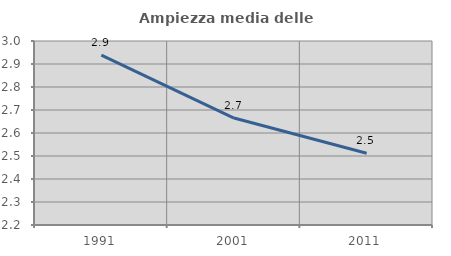
| Category | Ampiezza media delle famiglie |
|---|---|
| 1991.0 | 2.939 |
| 2001.0 | 2.665 |
| 2011.0 | 2.512 |